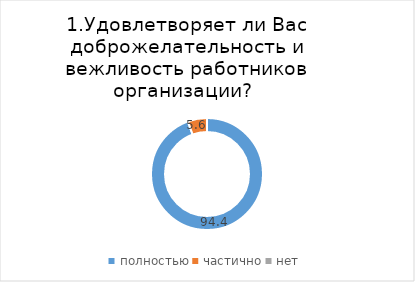
| Category | Тегульдетский |
|---|---|
| полностью | 94.444 |
| частично | 5.556 |
| нет | 0 |